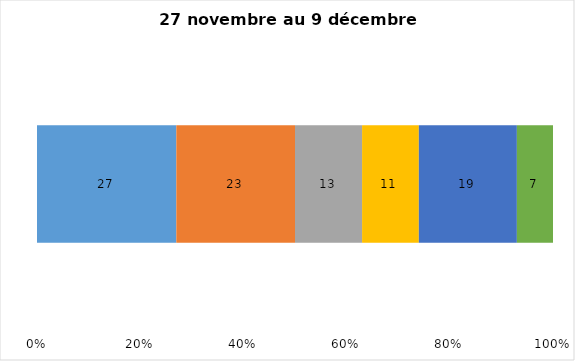
| Category | Plusieurs fois par jour | Une fois par jour | Quelques fois par semaine   | Une fois par semaine ou moins   |  Jamais   |  Je n’utilise pas les médias sociaux |
|---|---|---|---|---|---|---|
| 0 | 27 | 23 | 13 | 11 | 19 | 7 |